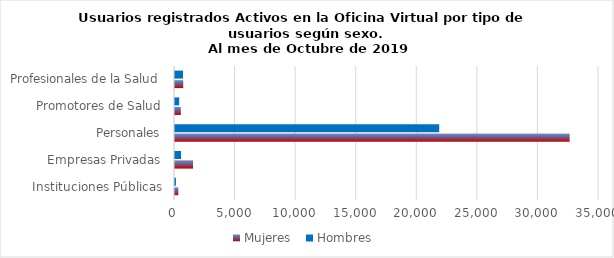
| Category | Mujeres | Hombres |
|---|---|---|
| Instituciones Públicas | 275 | 77 |
| Empresas Privadas | 1489 | 497 |
| Personales | 32578 | 21810 |
| Promotores de Salud | 480 | 345 |
| Profesionales de la Salud | 679 | 661 |